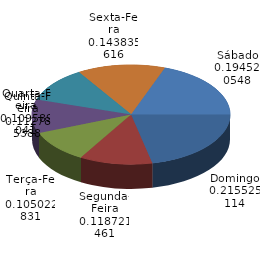
| Category | Qtde Vítimas |
|---|---|
| Domingo | 472 |
| Segunda-Feira | 260 |
| Terça-Feira | 230 |
| Quarta-Feira | 240 |
| Quinta-Feira | 247 |
| Sexta-Feira | 315 |
| Sábado | 426 |